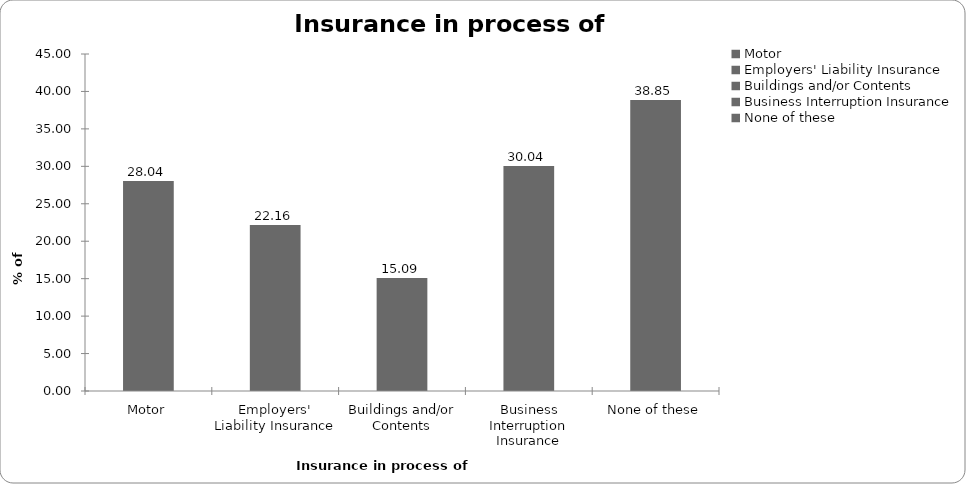
| Category | Insurance in process of buying |
|---|---|
| Motor | 28.037 |
| Employers' Liability Insurance | 22.163 |
| Buildings and/or Contents | 15.087 |
| Business Interruption Insurance | 30.04 |
| None of these | 38.852 |